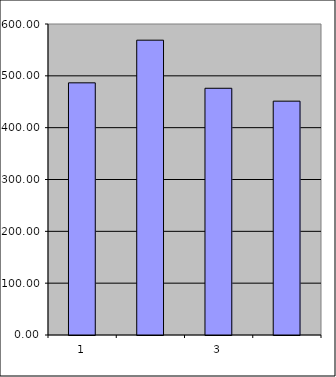
| Category | Series 0 |
|---|---|
| 0 | 486.5 |
| 1 | 568.772 |
| 2 | 476.012 |
| 3 | 451.128 |